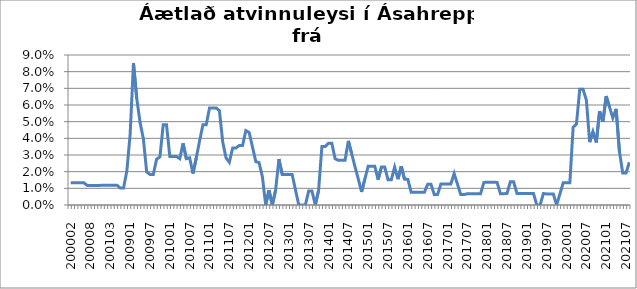
| Category | Series 0 |
|---|---|
| 200002 | 0.013 |
| 200003 | 0.013 |
| 200004 | 0.013 |
| 200005 | 0.013 |
| 200006 | 0.013 |
| 200007 | 0.012 |
| 200008 | 0.012 |
| 200010 | 0.012 |
| 200011 | 0.012 |
| 200012 | 0.012 |
| 200101 | 0.012 |
| 200102 | 0.012 |
| 200103 | 0.012 |
| 200104 | 0.012 |
| 200105 | 0.012 |
| 200810 | 0.01 |
| 200811 | 0.01 |
| 200812 | 0.02 |
| 200901 | 0.043 |
| 200902 | 0.085 |
| 200903 | 0.064 |
| 200904 | 0.05 |
| 200905 | 0.04 |
| 200906 | 0.02 |
| 200907 | 0.018 |
| 200908 | 0.018 |
| 200909 | 0.028 |
| 200910 | 0.029 |
| 200911 | 0.048 |
| 200912 | 0.048 |
| 201001 | 0.029 |
| 201002 | 0.029 |
| 201003 | 0.029 |
| 201004 | 0.028 |
| 201005 | 0.037 |
| 201006 | 0.028 |
| 201007 | 0.028 |
| 201008 | 0.019 |
| 201009 | 0.028 |
| 201010 | 0.038 |
| 201011 | 0.048 |
| 201012 | 0.048 |
| 201101 | 0.058 |
| 201102 | 0.058 |
| 201103 | 0.058 |
| 201104 | 0.057 |
| 201105 | 0.038 |
| 201106 | 0.028 |
| 201107 | 0.026 |
| 201108 | 0.034 |
| 201109 | 0.034 |
| 201110 | 0.036 |
| 201111 | 0.036 |
| 201112 | 0.045 |
| 201201 | 0.043 |
| 201202 | 0.035 |
| 201203 | 0.026 |
| 201204 | 0.025 |
| 201205 | 0.017 |
| 201206 | 0 |
| 201207 | 0.009 |
| 201208 | 0 |
| 201209 | 0.009 |
| 201210 | 0.028 |
| 201211 | 0.018 |
| 201212 | 0.018 |
| 201301 | 0.018 |
| 201302 | 0.018 |
| 201303 | 0.009 |
| 201304 | 0 |
| 201305 | 0 |
| 201306 | 0 |
| 201307 | 0.008 |
| 201308 | 0.008 |
| 201309 | 0 |
| 201310 | 0.009 |
| 201311 | 0.035 |
| 201312 | 0.035 |
| 201401 | 0.037 |
| 201402 | 0.037 |
| 201403 | 0.028 |
| 201404 | 0.027 |
| 201405 | 0.027 |
| 201406 | 0.027 |
| 201407 | 0.038 |
| 201408 | 0.031 |
| 201409 | 0.023 |
| 201410 | 0.016 |
| 201411 | 0.008 |
| 201412 | 0.016 |
| 201501 | 0.023 |
| 201502 | 0.023 |
| 201503 | 0.023 |
| 201504 | 0.015 |
| 201505 | 0.023 |
| 201506 | 0.023 |
| 201507 | 0.015 |
| 201508 | 0.015 |
| 201509 | 0.023 |
| 201510 | 0.016 |
| 201511 | 0.023 |
| 201512 | 0.016 |
| 201601 | 0.015 |
| 201602 | 0.008 |
| 201603 | 0.008 |
| 201604 | 0.008 |
| 201605 | 0.008 |
| 201606 | 0.008 |
| 201607 | 0.012 |
| 201608 | 0.012 |
| 201609 | 0.006 |
| 201610 | 0.006 |
| 201611 | 0.013 |
| 201612 | 0.013 |
| 201701 | 0.013 |
| 201702 | 0.013 |
| 201703 | 0.019 |
| 201704 | 0.013 |
| 201705 | 0.006 |
| 201706 | 0.006 |
| 201707 | 0.007 |
| 201708 | 0.007 |
| 201709 | 0.007 |
| 201710 | 0.007 |
| 201711 | 0.007 |
| 201712 | 0.014 |
| 201801 | 0.014 |
| 201802 | 0.014 |
| 201803 | 0.014 |
| 201804 | 0.014 |
| 201805 | 0.007 |
| 201806 | 0.007 |
| 201807 | 0.007 |
| 201808 | 0.014 |
| 201809 | 0.014 |
| 201810 | 0.007 |
| 201811 | 0.007 |
| 201812 | 0.007 |
| 201901 | 0.007 |
| 201902 | 0.007 |
| 201903 | 0.007 |
| 201904 | 0 |
| 201905 | 0 |
| 201906 | 0.007 |
| 201907 | 0.007 |
| 201908 | 0.007 |
| 201909 | 0.007 |
| 201910 | 0 |
| 201911 | 0.007 |
| 201912 | 0.013 |
| 202001 | 0.013 |
| 202002 | 0.013 |
| 202003 | 0.047 |
| 202004 | 0.049 |
| 202005 | 0.069 |
| 202006 | 0.069 |
| 202007 | 0.063 |
| 202008 | 0.038 |
| 202009 | 0.044 |
| 202010 | 0.038 |
| 202011 | 0.056 |
| 202012 | 0.05 |
| 202101 | 0.065 |
| 202102 | 0.059 |
| 202103 | 0.052 |
| 202104 | 0.058 |
| 202105 | 0.032 |
| 202106 | 0.019 |
| 202107 | 0.019 |
| 202108 | 0.026 |